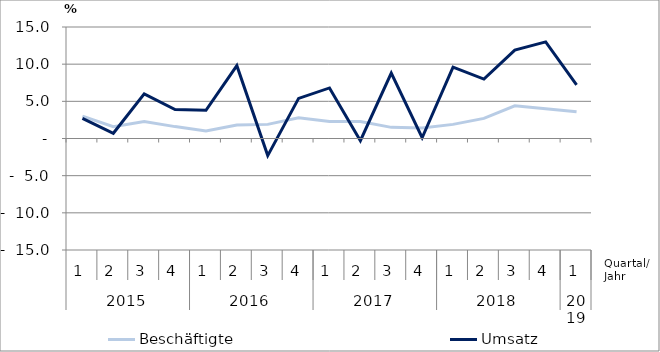
| Category | Beschäftigte | Umsatz |
|---|---|---|
| 0 | 3 | 2.7 |
| 1 | 1.6 | 0.7 |
| 2 | 2.3 | 6 |
| 3 | 1.6 | 3.9 |
| 4 | 1 | 3.8 |
| 5 | 1.8 | 9.8 |
| 6 | 1.9 | -2.3 |
| 7 | 2.8 | 5.4 |
| 8 | 2.3 | 6.8 |
| 9 | 2.3 | -0.3 |
| 10 | 1.5 | 8.8 |
| 11 | 1.4 | 0.1 |
| 12 | 1.9 | 9.6 |
| 13 | 2.7 | 8 |
| 14 | 4.4 | 11.9 |
| 15 | 4 | 13 |
| 16 | 3.6 | 7.2 |